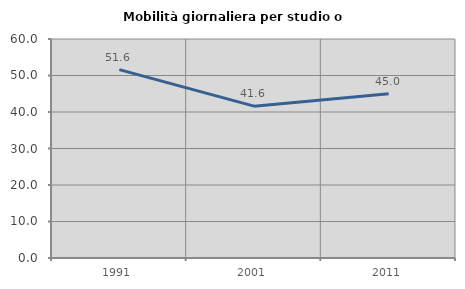
| Category | Mobilità giornaliera per studio o lavoro |
|---|---|
| 1991.0 | 51.613 |
| 2001.0 | 41.604 |
| 2011.0 | 44.978 |